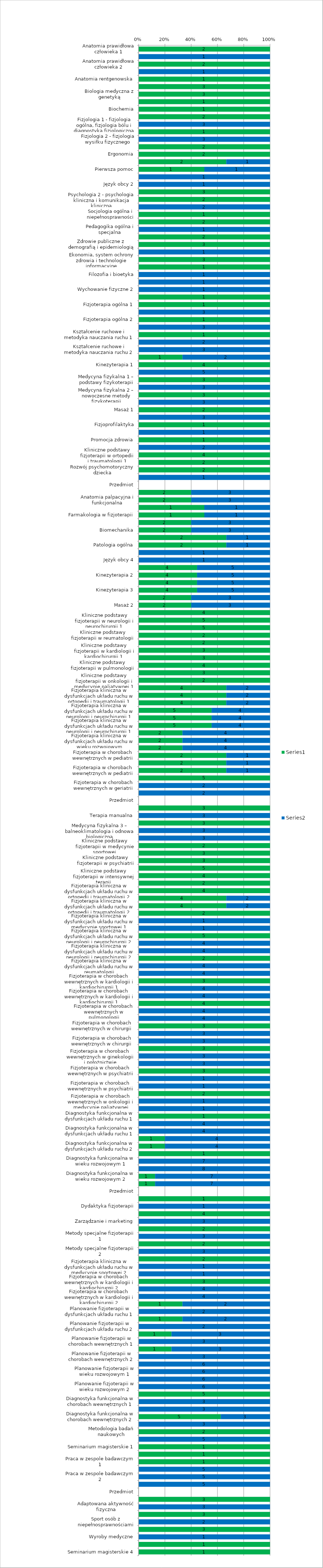
| Category | Series 0 | Series 1 |
|---|---|---|
| Anatomia prawidłowa człowieka 1 | 2 | 0 |
| Anatomia prawidłowa człowieka 1 | 0 | 1 |
| Anatomia prawidłowa człowieka 2 | 2 | 0 |
| Anatomia prawidłowa człowieka 2 | 0 | 1 |
| Anatomia rentgenowska | 1 | 0 |
| Biologia medyczna z genetyką | 3 | 0 |
| Biologia medyczna z genetyką | 3 | 0 |
| Biochemia | 1 | 0 |
| Biochemia | 1 | 0 |
| Fizjologia 1 - fizjologia ogólna, fizjologia bólu i diagnostyka fizjologiczna | 2 | 0 |
| Fizjologia 1 - fizjologia ogólna, fizjologia bólu i diagnostyka fizjologiczna | 0 | 3 |
| Fizjologia 2 - fizjologia wysiłku fizycznego | 1 | 0 |
| Fizjologia 2 - fizjologia wysiłku fizycznego | 0 | 3 |
| Biofizyka | 2 | 0 |
| Ergonomia | 2 | 0 |
| Ergonomia | 2 | 1 |
| Pierwsza pomoc | 1 | 1 |
| Język obcy 1 | 0 | 1 |
| Język obcy 2 | 0 | 1 |
| Psychologia 1 - psychologia ogólna i psychoterapia | 3 | 0 |
| Psychologia 2 - psychologia kliniczna i komunikacja kliniczna | 2 | 0 |
| Psychologia 2 - psychologia kliniczna i komunikacja kliniczna | 0 | 2 |
| Socjologia ogólna i niepełnosprawności | 1 | 0 |
| Pedagogika ogólna i specjalna | 2 | 0 |
| Pedagogika ogólna i specjalna | 0 | 1 |
| Podstawy prawa | 2 | 0 |
| Zdrowie publiczne z demografią i epidemiologią | 3 | 0 |
| Zdrowie publiczne z demografią i epidemiologią | 0 | 1 |
| Ekonomia, system ochrony zdrowia i technologie informacyjne | 3 | 0 |
| Filozofia i bioetyka | 1 | 0 |
| Filozofia i bioetyka | 0 | 1 |
| Wychowanie fizyczne 1 | 0 | 1 |
| Wychowanie fizyczne 2 | 0 | 1 |
| Historia fizjoterapii | 1 | 0 |
| Fizjoterapia ogólna 1 | 1 | 0 |
| Fizjoterapia ogólna 1 | 0 | 3 |
| Fizjoterapia ogólna 2 | 1 | 0 |
| Fizjoterapia ogólna 2 | 0 | 3 |
| Kształcenie ruchowe i metodyka nauczania ruchu 1 | 1 | 0 |
| Kształcenie ruchowe i metodyka nauczania ruchu 1 | 0 | 2 |
| Kształcenie ruchowe i metodyka nauczania ruchu 2 | 0 | 3 |
| Kształcenie ruchowe i metodyka nauczania ruchu 3 - pływanie | 1 | 2 |
| Kinezyterapia 1 | 4 | 0 |
| Kinezyterapia 1 | 0 | 5 |
| Medycyna fizykalna 1 – podstawy fizykoterapii | 3 | 0 |
| Medycyna fizykalna 1 – podstawy fizykoterapii | 0 | 3 |
| Medycyna fizykalna 2 – nowoczesne metody fizykoterapii | 3 | 0 |
| Medycyna fizykalna 2 – nowoczesne metody fizykoterapii | 0 | 3 |
| Masaż 1 | 2 | 0 |
| Masaż 1 | 0 | 3 |
| Fizjoprofilaktyka | 1 | 0 |
| Fizjoprofilaktyka | 0 | 1 |
| Promocja zdrowia | 1 | 0 |
| Promocja zdrowia | 0 | 2 |
| Kliniczne podstawy fizjoterapii w ortopedii i traumatologii 1 | 4 | 0 |
| Kliniczne podstawy fizjoterapii w pediatrii | 2 | 0 |
| Rozwój psychomotoryczny dziecka | 2 | 0 |
| Rozwój psychomotoryczny dziecka | 0 | 1 |
| Przedmiot | 0 | 0 |
| Anatomia palpacyjna i funkcjonalna | 2 | 3 |
| Anatomia palpacyjna i funkcjonalna | 2 | 3 |
| Farmakologia w fizjoterapii | 1 | 1 |
| Farmakologia w fizjoterapii | 1 | 1 |
| Biomechanika | 2 | 3 |
| Biomechanika | 2 | 3 |
| Patologia ogólna | 2 | 1 |
| Patologia ogólna | 2 | 1 |
| Język obcy 3 | 0 | 1 |
| Język obcy 4 | 0 | 1 |
| Kinezyterapia 2 | 4 | 5 |
| Kinezyterapia 2 | 4 | 5 |
| Kinezyterapia 3 | 4 | 5 |
| Kinezyterapia 3 | 4 | 5 |
| Masaż 2 | 2 | 3 |
| Masaż 2 | 2 | 3 |
| Kliniczne podstawy fizjoterapii w ortopedii i traumatologii 2 | 4 | 0 |
| Kliniczne podstawy fizjoterapii w neurologii i neurochirurgii 1 | 5 | 0 |
| Kliniczne podstawy fizjoterapii w neurologii i neurochirurgii 2 | 5 | 0 |
| Kliniczne podstawy fizjoterapii w reumatologii | 2 | 0 |
| Kliniczne podstawy fizjoterapii w neurologii dziecięcej | 2 | 0 |
| Kliniczne podstawy fizjoterapii w kardiologii i kardiochirurgii 1 | 3 | 0 |
| Kliniczne podstawy fizjoterapii w kardiologii i kardiochirurgii 2 | 3 | 0 |
| Kliniczne podstawy fizjoterapii w pulmonologii | 4 | 0 |
| Kliniczne podstawy fizjoterapii w ginekologii i położnictwie | 3 | 0 |
| Kliniczne podstawy fizjoterapii w onkologii i medycynie paliatywnej 1 | 2 | 0 |
| Fizjoterapia kliniczna w dysfunkcjach układu ruchu w ortopedii i traumatologii 1 | 4 | 2 |
| Fizjoterapia kliniczna w dysfunkcjach układu ruchu w ortopedii i traumatologii 1 | 4 | 2 |
| Fizjoterapia kliniczna w dysfunkcjach układu ruchu w ortopedii i traumatologii 1 | 4 | 2 |
| Fizjoterapia kliniczna w dysfunkcjach układu ruchu w neurologii i neurochirurgii 1 | 5 | 4 |
| Fizjoterapia kliniczna w dysfunkcjach układu ruchu w neurologii i neurochirurgii 1 | 5 | 4 |
| Fizjoterapia kliniczna w dysfunkcjach układu ruchu w neurologii i neurochirurgii 1 | 5 | 4 |
| Fizjoterapia kliniczna w dysfunkcjach układu ruchu w wieku rozwojowym | 2 | 4 |
| Fizjoterapia kliniczna w dysfunkcjach układu ruchu w wieku rozwojowym | 2 | 4 |
| Fizjoterapia kliniczna w dysfunkcjach układu ruchu w wieku rozwojowym | 2 | 4 |
| Fizjoterapia w chorobach wewnętrznych w pediatrii | 2 | 1 |
| Fizjoterapia w chorobach wewnętrznych w pediatrii | 2 | 1 |
| Fizjoterapia w chorobach wewnętrznych w pediatrii | 2 | 1 |
| Fizjoterapia w chorobach wewnętrznych w geriatrii | 5 | 0 |
| Fizjoterapia w chorobach wewnętrznych w geriatrii | 0 | 2 |
| Fizjoterapia w chorobach wewnętrznych w geriatrii | 0 | 2 |
| Przedmiot | 0 | 0 |
| Terapia manualna | 3 | 0 |
| Terapia manualna | 0 | 3 |
| Medycyna fizykalna 3 – balneoklimatologia i odnowa biologiczna | 3 | 0 |
| Medycyna fizykalna 3 – balneoklimatologia i odnowa biologiczna | 0 | 3 |
| Medycyna fizykalna 3 – balneoklimatologia i odnowa biologiczna | 0 | 3 |
| Kliniczne podstawy fizjoterapii w medycynie sportowej | 2 | 0 |
| Kliniczne podstawy fizjoterapii w chirurgii | 3 | 0 |
| Kliniczne podstawy fizjoterapii w psychiatrii | 3 | 0 |
| Kliniczne podstawy fizjoterapii w geriatrii | 5 | 0 |
| Kliniczne podstawy fizjoterapii w intensywnej terapii | 4 | 0 |
| Kliniczne podstawy fizjoterapii w onkologii i medycynie paliatywnej 2 | 2 | 0 |
| Fizjoterapia kliniczna w dysfunkcjach układu ruchu w ortopedii i traumatologii 2 | 4 | 0 |
| Fizjoterapia kliniczna w dysfunkcjach układu ruchu w ortopedii i traumatologii 2 | 4 | 2 |
| Fizjoterapia kliniczna w dysfunkcjach układu ruchu w ortopedii i traumatologii 2 | 4 | 2 |
| Fizjoterapia kliniczna w dysfunkcjach układu ruchu w medycynie sportowej 1 | 2 | 0 |
| Fizjoterapia kliniczna w dysfunkcjach układu ruchu w medycynie sportowej 1 | 0 | 1 |
| Fizjoterapia kliniczna w dysfunkcjach układu ruchu w medycynie sportowej 1 | 0 | 1 |
| Fizjoterapia kliniczna w dysfunkcjach układu ruchu w neurologii i neurochirurgii 2 | 5 | 0 |
| Fizjoterapia kliniczna w dysfunkcjach układu ruchu w neurologii i neurochirurgii 2 | 0 | 4 |
| Fizjoterapia kliniczna w dysfunkcjach układu ruchu w neurologii i neurochirurgii 2 | 0 | 4 |
| Fizjoterapia kliniczna w dysfunkcjach układu ruchu w reumatologii | 2 | 0 |
| Fizjoterapia kliniczna w dysfunkcjach układu ruchu w reumatologii | 0 | 4 |
| Fizjoterapia kliniczna w dysfunkcjach układu ruchu w reumatologii | 0 | 4 |
| Fizjoterapia w chorobach wewnętrznych w kardiologii i kardiochirurgii 1 | 3 | 0 |
| Fizjoterapia w chorobach wewnętrznych w kardiologii i kardiochirurgii 1 | 0 | 4 |
| Fizjoterapia w chorobach wewnętrznych w kardiologii i kardiochirurgii 1 | 0 | 4 |
| Fizjoterapia w chorobach wewnętrznych w pulmonologii | 4 | 0 |
| Fizjoterapia w chorobach wewnętrznych w pulmonologii | 0 | 4 |
| Fizjoterapia w chorobach wewnętrznych w pulmonologii | 0 | 4 |
| Fizjoterapia w chorobach wewnętrznych w chirurgii  | 3 | 0 |
| Fizjoterapia w chorobach wewnętrznych w chirurgii  | 0 | 3 |
| Fizjoterapia w chorobach wewnętrznych w chirurgii  | 0 | 3 |
| Fizjoterapia w chorobach wewnętrznych w ginekologii i położnictwie | 3 | 0 |
| Fizjoterapia w chorobach wewnętrznych w ginekologii i położnictwie | 0 | 3 |
| Fizjoterapia w chorobach wewnętrznych w ginekologii i położnictwie | 0 | 3 |
| Fizjoterapia w chorobach wewnętrznych w psychiatrii | 3 | 0 |
| Fizjoterapia w chorobach wewnętrznych w psychiatrii | 0 | 1 |
| Fizjoterapia w chorobach wewnętrznych w psychiatrii | 0 | 1 |
| Fizjoterapia w chorobach wewnętrznych w onkologii i medycynie paliatywnej | 2 | 0 |
| Fizjoterapia w chorobach wewnętrznych w onkologii i medycynie paliatywnej | 0 | 1 |
| Fizjoterapia w chorobach wewnętrznych w onkologii i medycynie paliatywnej | 0 | 1 |
| Diagnostyka funkcjonalna w dysfunkcjach układu ruchu 1 | 1 | 0 |
| Diagnostyka funkcjonalna w dysfunkcjach układu ruchu 1 | 0 | 4 |
| Diagnostyka funkcjonalna w dysfunkcjach układu ruchu 1 | 0 | 4 |
| Diagnostyka funkcjonalna w dysfunkcjach układu ruchu 2 | 1 | 4 |
| Diagnostyka funkcjonalna w dysfunkcjach układu ruchu 2 | 1 | 4 |
| Diagnostyka funkcjonalna w wieku rozwojowym 1 | 1 | 0 |
| Diagnostyka funkcjonalna w wieku rozwojowym 1 | 0 | 7 |
| Diagnostyka funkcjonalna w wieku rozwojowym 1 | 0 | 8 |
| Diagnostyka funkcjonalna w wieku rozwojowym 2 | 1 | 7 |
| Diagnostyka funkcjonalna w wieku rozwojowym 2 | 1 | 7 |
| Przedmiot | 0 | 0 |
| Dydaktyka fizjoterapii | 1 | 0 |
| Dydaktyka fizjoterapii | 0 | 1 |
| Zarządzanie i marketing | 4 | 0 |
| Zarządzanie i marketing | 0 | 3 |
| Metody specjalne fizjoterapii 1 | 2 | 0 |
| Metody specjalne fizjoterapii 1 | 0 | 3 |
| Metody specjalne fizjoterapii 2 | 2 | 0 |
| Metody specjalne fizjoterapii 2 | 0 | 3 |
| Fizjoterapia kliniczna w dysfunkcjach układu ruchu w medycynie sportowej 2 | 2 | 0 |
| Fizjoterapia kliniczna w dysfunkcjach układu ruchu w medycynie sportowej 2 | 0 | 1 |
| Fizjoterapia kliniczna w dysfunkcjach układu ruchu w medycynie sportowej 2 | 0 | 1 |
| Fizjoterapia w chorobach wewnętrznych w kardiologii i kardiochirurgii 2 | 3 | 0 |
| Fizjoterapia w chorobach wewnętrznych w kardiologii i kardiochirurgii 2 | 0 | 4 |
| Fizjoterapia w chorobach wewnętrznych w kardiologii i kardiochirurgii 2 | 0 | 4 |
| Planowanie fizjoterapii w dysfunkcjach układu ruchu 1 | 1 | 2 |
| Planowanie fizjoterapii w dysfunkcjach układu ruchu 1 | 0 | 2 |
| Planowanie fizjoterapii w dysfunkcjach układu ruchu 2 | 1 | 2 |
| Planowanie fizjoterapii w dysfunkcjach układu ruchu 2 | 0 | 2 |
| Planowanie fizjoterapii w chorobach wewnętrznych 1 | 1 | 3 |
| Planowanie fizjoterapii w chorobach wewnętrznych 1 | 0 | 3 |
| Planowanie fizjoterapii w chorobach wewnętrznych 2 | 1 | 3 |
| Planowanie fizjoterapii w chorobach wewnętrznych 2 | 0 | 3 |
| Planowanie fizjoterapii w wieku rozwojowym 1 | 0 | 6 |
| Planowanie fizjoterapii w wieku rozwojowym 1 | 0 | 6 |
| Planowanie fizjoterapii w wieku rozwojowym 2 | 0 | 6 |
| Planowanie fizjoterapii w wieku rozwojowym 2 | 0 | 6 |
| Diagnostyka funkcjonalna w chorobach wewnętrznych 1 | 5 | 0 |
| Diagnostyka funkcjonalna w chorobach wewnętrznych 1 | 0 | 3 |
| Diagnostyka funkcjonalna w chorobach wewnętrznych 1 | 0 | 3 |
| Diagnostyka funkcjonalna w chorobach wewnętrznych 2 | 5 | 3 |
| Diagnostyka funkcjonalna w chorobach wewnętrznych 2 | 0 | 3 |
| Metodologia badań naukowych | 2 | 0 |
| Metodologia badań naukowych | 0 | 5 |
| Seminarium magisterskie 1 | 1 | 0 |
| Seminarium magisterskie 2 | 1 | 0 |
| Praca w zespole badawczym 1 | 1 | 0 |
| Praca w zespole badawczym 1 | 0 | 5 |
| Praca w zespole badawczym 2 | 0 | 5 |
| Praca w zespole badawczym 2 | 0 | 5 |
| Przedmiot | 0 | 0 |
| Adaptowana aktywność fizyczna | 3 | 0 |
| Adaptowana aktywność fizyczna | 0 | 3 |
| Sport osób z niepełnosprawnościami | 3 | 0 |
| Sport osób z niepełnosprawnościami | 0 | 2 |
| Wyroby medyczne | 3 | 0 |
| Wyroby medyczne | 0 | 1 |
| Seminarium magisterskie 3 | 1 | 0 |
| Seminarium magisterskie 4 | 1 | 0 |